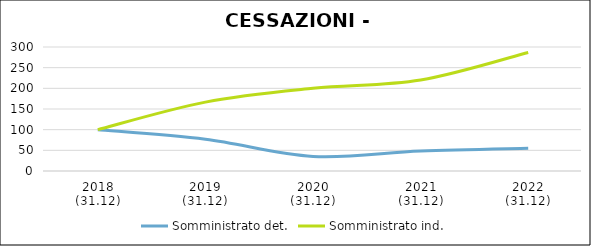
| Category | Somministrato det. | Somministrato ind. |
|---|---|---|
| 2018
(31.12) | 100 | 100 |
| 2019
(31.12) | 76.8 | 166.667 |
| 2020
(31.12) | 35.336 | 200 |
| 2021
(31.12) | 48.275 | 220 |
| 2022
(31.12) | 55.116 | 286.667 |